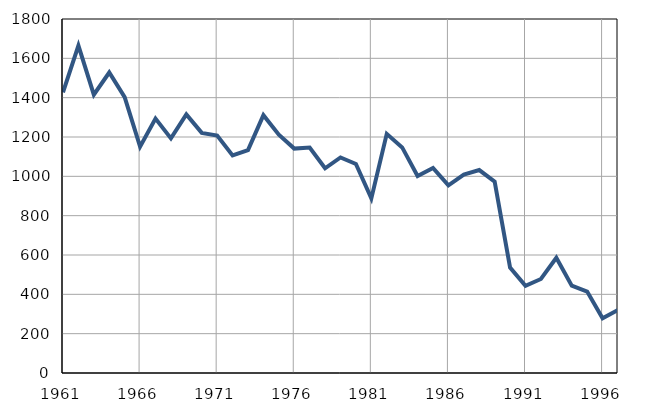
| Category | Infants
deaths |
|---|---|
| 1961.0 | 1427 |
| 1962.0 | 1665 |
| 1963.0 | 1415 |
| 1964.0 | 1528 |
| 1965.0 | 1403 |
| 1966.0 | 1151 |
| 1967.0 | 1294 |
| 1968.0 | 1193 |
| 1969.0 | 1315 |
| 1970.0 | 1221 |
| 1971.0 | 1207 |
| 1972.0 | 1106 |
| 1973.0 | 1133 |
| 1974.0 | 1311 |
| 1975.0 | 1212 |
| 1976.0 | 1141 |
| 1977.0 | 1146 |
| 1978.0 | 1041 |
| 1979.0 | 1096 |
| 1980.0 | 1063 |
| 1981.0 | 888 |
| 1982.0 | 1216 |
| 1983.0 | 1147 |
| 1984.0 | 1002 |
| 1985.0 | 1043 |
| 1986.0 | 954 |
| 1987.0 | 1009 |
| 1988.0 | 1032 |
| 1989.0 | 973 |
| 1990.0 | 536 |
| 1991.0 | 443 |
| 1992.0 | 478 |
| 1993.0 | 586 |
| 1994.0 | 444 |
| 1995.0 | 414 |
| 1996.0 | 278 |
| 1997.0 | 320 |